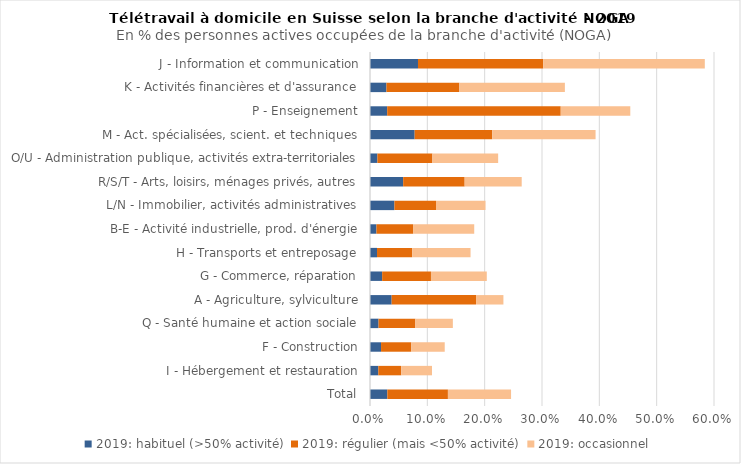
| Category | 2019: habituel (>50% activité) | 2019: régulier (mais <50% activité) | 2019: occasionnel  |
|---|---|---|---|
| Total | 0.03 | 0.106 | 0.11 |
| I - Hébergement et restauration | 0.014 | 0.04 | 0.054 |
| F - Construction | 0.019 | 0.053 | 0.058 |
| Q - Santé humaine et action sociale | 0.015 | 0.064 | 0.065 |
| A - Agriculture, sylviculture | 0.038 | 0.147 | 0.048 |
| G - Commerce, réparation | 0.021 | 0.085 | 0.097 |
| H - Transports et entreposage | 0.012 | 0.061 | 0.102 |
| B-E - Activité industrielle, prod. d'énergie | 0.011 | 0.064 | 0.107 |
| L/N - Immobilier, activités administratives | 0.043 | 0.073 | 0.086 |
| R/S/T - Arts, loisirs, ménages privés, autres | 0.058 | 0.107 | 0.1 |
| O/U - Administration publique, activités extra-territoriales | 0.013 | 0.096 | 0.115 |
| M - Act. spécialisées, scient. et techniques | 0.078 | 0.135 | 0.18 |
| P - Enseignement | 0.03 | 0.303 | 0.121 |
| K - Activités financières et d'assurance | 0.029 | 0.127 | 0.184 |
| J - Information et communication | 0.084 | 0.218 | 0.282 |